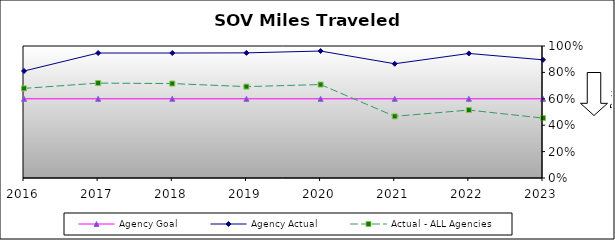
| Category | Agency Goal | Agency Actual | Actual - ALL Agencies |
|---|---|---|---|
| 2016.0 | 0.6 | 0.811 | 0.679 |
| 2017.0 | 0.6 | 0.947 | 0.719 |
| 2018.0 | 0.6 | 0.947 | 0.715 |
| 2019.0 | 0.6 | 0.948 | 0.692 |
| 2020.0 | 0.6 | 0.962 | 0.708 |
| 2021.0 | 0.6 | 0.866 | 0.467 |
| 2022.0 | 0.6 | 0.944 | 0.515 |
| 2023.0 | 0.6 | 0.895 | 0.454 |